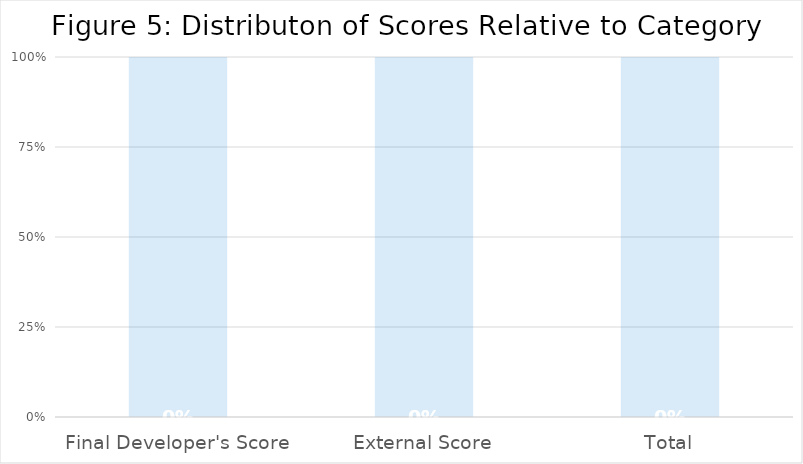
| Category | Series 0 | Series 1 |
|---|---|---|
| Final Developer's Score | 0 | 1 |
| External Score | 0 | 1 |
| Total | 0 | 1 |